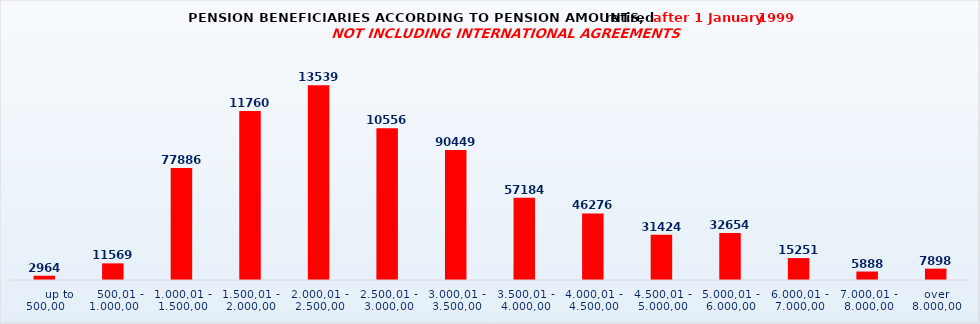
| Category | Series 0 |
|---|---|
|       up to 500,00 | 2964 |
|    500,01 - 1.000,00 | 11569 |
| 1.000,01 - 1.500,00 | 77886 |
| 1.500,01 - 2.000,00 | 117604 |
| 2.000,01 - 2.500,00 | 135396 |
| 2.500,01 - 3.000,00 | 105561 |
| 3.000,01 - 3.500,00 | 90449 |
| 3.500,01 - 4.000,00 | 57184 |
| 4.000,01 - 4.500,00 | 46276 |
| 4.500,01 - 5.000,00 | 31424 |
| 5.000,01 - 6.000,00 | 32654 |
| 6.000,01 - 7.000,00 | 15251 |
| 7.000,01 - 8.000,00 | 5888 |
| over 8.000,00 | 7898 |